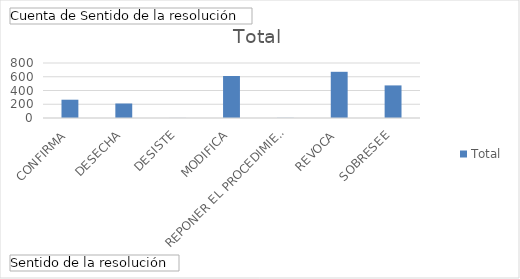
| Category | Total |
|---|---|
| CONFIRMA | 266 |
| DESECHA | 211 |
| DESISTE | 1 |
| MODIFICA | 611 |
| REPONER EL PROCEDIMIENTO | 2 |
| REVOCA | 672 |
| SOBRESEE | 474 |